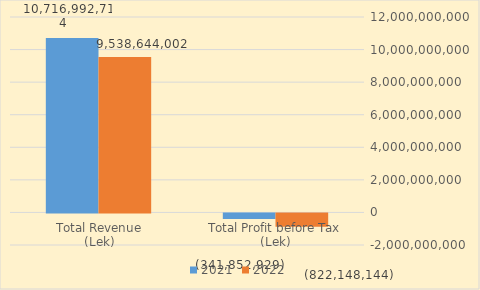
| Category | 2021 | 2022 |
|---|---|---|
| Total Revenue
(Lek) | 10716992714 | 9538644002 |
| Total Profit before Tax
(Lek) | -341852929 | -822148144 |